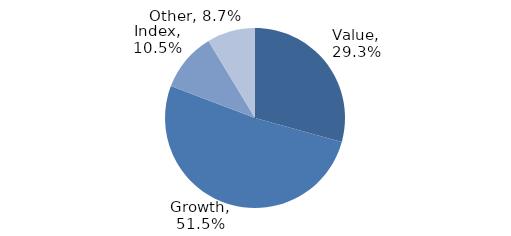
| Category | Investment Style |
|---|---|
| Value | 0.293 |
| Growth | 0.515 |
| Index | 0.105 |
| Other | 0.087 |